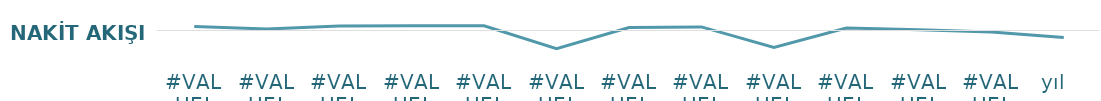
| Category | Nakit Akışı |
|---|---|
| #VALUE! | 169 |
| #VALUE! | 69 |
| #VALUE! | 192 |
| #VALUE! | 199 |
| #VALUE! | 204 |
| #VALUE! | -771 |
| #VALUE! | 124 |
| #VALUE! | 154 |
| #VALUE! | -721 |
| #VALUE! | 109 |
| #VALUE! | 34 |
| #VALUE! | -61 |
| yıl   | -299 |